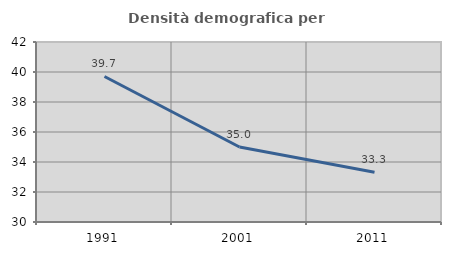
| Category | Densità demografica |
|---|---|
| 1991.0 | 39.703 |
| 2001.0 | 35.002 |
| 2011.0 | 33.315 |